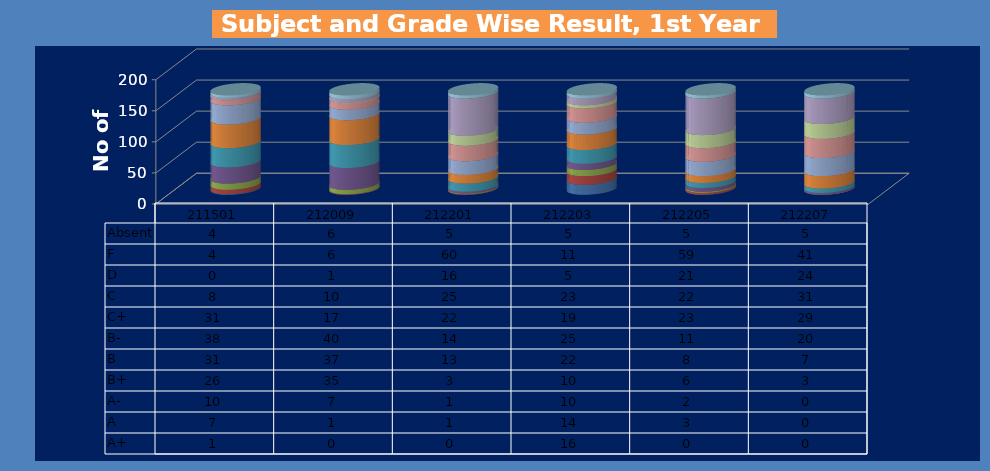
| Category | A+ | A | A- | B+ | B | B- | C+ | C | D | F | Absent |
|---|---|---|---|---|---|---|---|---|---|---|---|
| 211501.0 | 1 | 7 | 10 | 26 | 31 | 38 | 31 | 8 | 0 | 4 | 4 |
| 212009.0 | 0 | 1 | 7 | 35 | 37 | 40 | 17 | 10 | 1 | 6 | 6 |
| 212201.0 | 0 | 1 | 1 | 3 | 13 | 14 | 22 | 25 | 16 | 60 | 5 |
| 212203.0 | 16 | 14 | 10 | 10 | 22 | 25 | 19 | 23 | 5 | 11 | 5 |
| 212205.0 | 0 | 3 | 2 | 6 | 8 | 11 | 23 | 22 | 21 | 59 | 5 |
| 212207.0 | 0 | 0 | 0 | 3 | 7 | 20 | 29 | 31 | 24 | 41 | 5 |